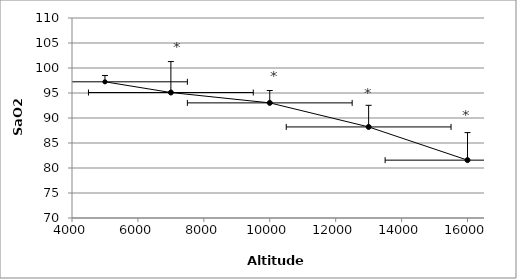
| Category | Series 0 |
|---|---|
| 5000.0 | 97.238 |
| 7000.0 | 95.095 |
| 10000.0 | 93.024 |
| 13000.0 | 88.214 |
| 16000.0 | 81.571 |